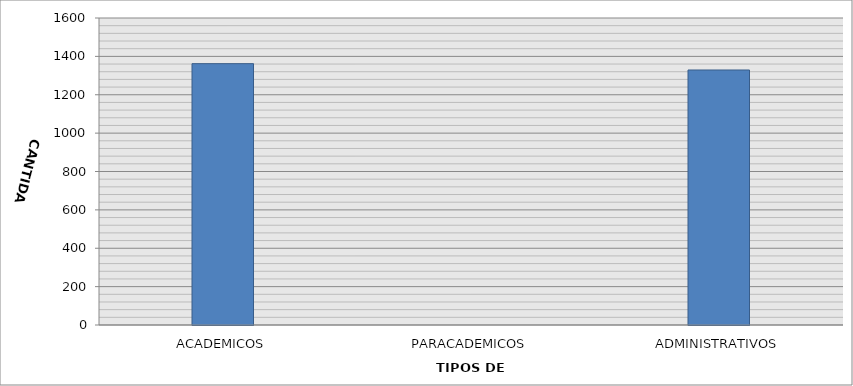
| Category | CANTIDAD |
|---|---|
| ACADEMICOS | 1362 |
| PARACADEMICOS | 0 |
| ADMINISTRATIVOS | 1329 |